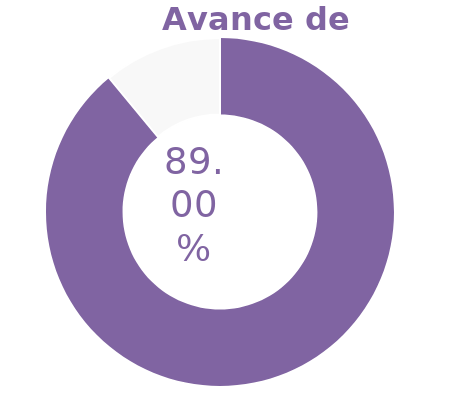
| Category | Series 0 |
|---|---|
| Acumulado 1 Trimestre | 0.89 |
| Año | -0.11 |